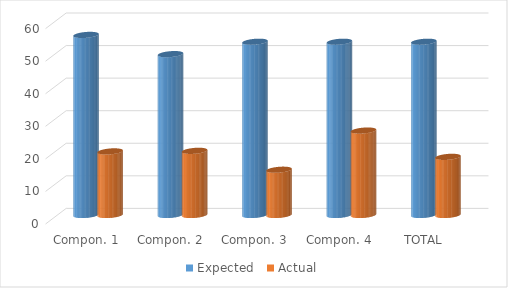
| Category | Expected  | Actual |
|---|---|---|
| Compon. 1 | 55.3 | 19.525 |
| Compon. 2 | 49.4 | 19.704 |
| Compon. 3 | 53.2 | 13.899 |
| Compon. 4 | 53.2 | 25.926 |
| TOTAL | 53.2 | 17.856 |